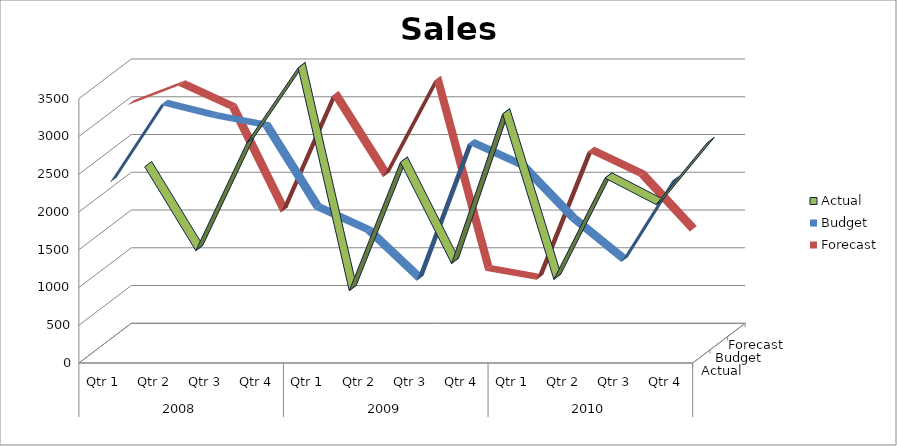
| Category | Actual | Budget | Forecast |
|---|---|---|---|
| 0 | 2180 | 2320 | 3170 |
| 1 | 1070 | 3350 | 3430 |
| 2 | 2500 | 3180 | 3120 |
| 3 | 3490 | 3050 | 1750 |
| 4 | 540 | 1970 | 3290 |
| 5 | 2240 | 1660 | 2220 |
| 6 | 900 | 1020 | 3490 |
| 7 | 2880 | 2830 | 980 |
| 8 | 690 | 2520 | 860 |
| 9 | 2030 | 1820 | 2550 |
| 10 | 1680 | 1270 | 2230 |
| 11 | 2500 | 2350 | 1500 |